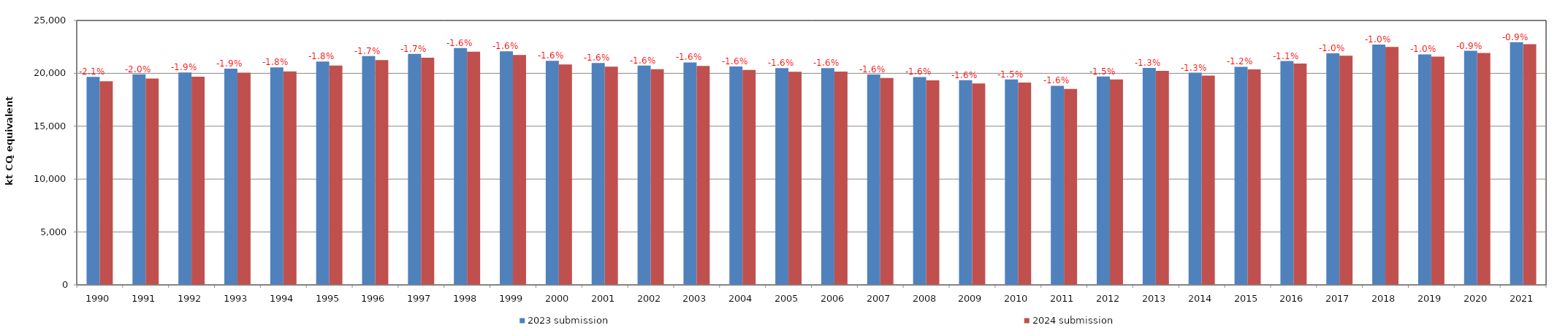
| Category | 2023 submission | 2024 submission |
|---|---|---|
| 1990.0 | 19668.606 | 19256.452 |
| 1991.0 | 19914.53 | 19514.502 |
| 1992.0 | 20070.946 | 19680.078 |
| 1993.0 | 20437.538 | 20058.26 |
| 1994.0 | 20556.232 | 20181.326 |
| 1995.0 | 21112.769 | 20742.655 |
| 1996.0 | 21626.98 | 21260.871 |
| 1997.0 | 21836.171 | 21471.378 |
| 1998.0 | 22393.611 | 22040.783 |
| 1999.0 | 22078.409 | 21733.855 |
| 2000.0 | 21182.751 | 20840.979 |
| 2001.0 | 20977.061 | 20635.041 |
| 2002.0 | 20731.388 | 20390.134 |
| 2003.0 | 21032.152 | 20695.873 |
| 2004.0 | 20655.585 | 20322.156 |
| 2005.0 | 20487.522 | 20156.952 |
| 2006.0 | 20494.828 | 20165.179 |
| 2007.0 | 19885.847 | 19559.524 |
| 2008.0 | 19653.81 | 19334.472 |
| 2009.0 | 19358.808 | 19047.097 |
| 2010.0 | 19427.951 | 19127.767 |
| 2011.0 | 18821.034 | 18525.593 |
| 2012.0 | 19706.417 | 19417.229 |
| 2013.0 | 20504.139 | 20229.079 |
| 2014.0 | 20056.242 | 19791.895 |
| 2015.0 | 20620.343 | 20365.733 |
| 2016.0 | 21161.488 | 20918.553 |
| 2017.0 | 21897.672 | 21670.521 |
| 2018.0 | 22719.206 | 22501.73 |
| 2019.0 | 21789.781 | 21576.372 |
| 2020.0 | 22133.282 | 21929.834 |
| 2021.0 | 22953.527 | 22754.045 |